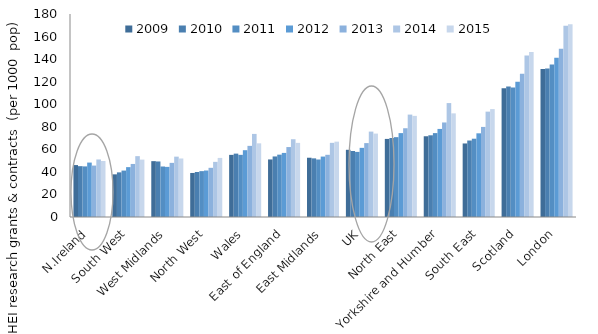
| Category | 2009 | 2010 | 2011 | 2012 | 2013 | 2014 | 2015 |
|---|---|---|---|---|---|---|---|
| N.Ireland | 46.041 | 45.075 | 44.864 | 48.261 | 45.598 | 51 | 49.631 |
| South West | 37.827 | 39.58 | 41.166 | 44.215 | 47.033 | 53.955 | 50.89 |
| West Midlands | 49.526 | 49.239 | 44.783 | 44.446 | 47.997 | 53.511 | 51.882 |
| North West | 39.043 | 39.887 | 40.667 | 41.213 | 43.609 | 48.888 | 52.393 |
| Wales | 55.09 | 56.2 | 55.105 | 59.23 | 63.073 | 73.665 | 65.315 |
| East of England | 51.028 | 53.691 | 55.282 | 56.823 | 62.019 | 68.957 | 65.723 |
| East Midlands | 52.549 | 51.999 | 50.988 | 53.587 | 55.152 | 65.751 | 66.806 |
| UK | 59.594 | 58.536 | 57.727 | 61.31 | 65.525 | 75.724 | 73.957 |
| North East | 69.239 | 70.039 | 70.791 | 74.386 | 78.704 | 90.8 | 89.66 |
| Yorkshire and Humber | 71.596 | 72.448 | 74.386 | 78.092 | 83.822 | 101.015 | 91.891 |
| South East | 65.209 | 67.817 | 69.423 | 74.202 | 79.876 | 93.429 | 95.696 |
| Scotland | 114.27 | 115.739 | 114.778 | 119.981 | 127.067 | 143.163 | 146.341 |
| London | 131.225 | 131.672 | 135.211 | 141.186 | 149.248 | 169.515 | 171.015 |